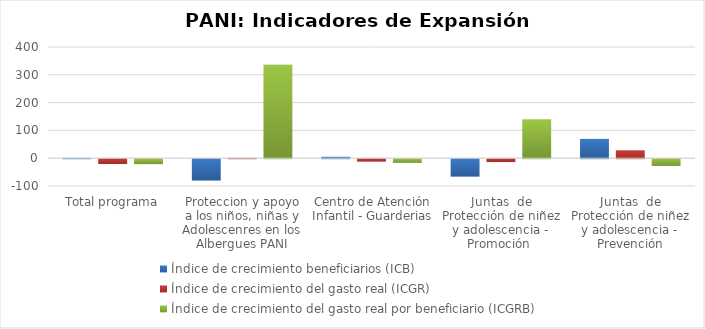
| Category | Índice de crecimiento beneficiarios (ICB)  | Índice de crecimiento del gasto real (ICGR)  | Índice de crecimiento del gasto real por beneficiario (ICGRB)  |
|---|---|---|---|
| Total programa | 0.964 | -17.436 | -18.224 |
| Proteccion y apoyo a los niños, niñas y Adolescenres en los Albergues PANI | -76.822 | 1.181 | 336.541 |
| Centro de Atención Infantil - Guarderias | 4.995 | -8.78 | -13.12 |
| Juntas  de Protección de niñez y adolescencia - Promoción  | -62.686 | -10.298 | 140.399 |
| Juntas  de Protección de niñez y adolescencia - Prevención | 69.399 | 28.448 | -24.174 |